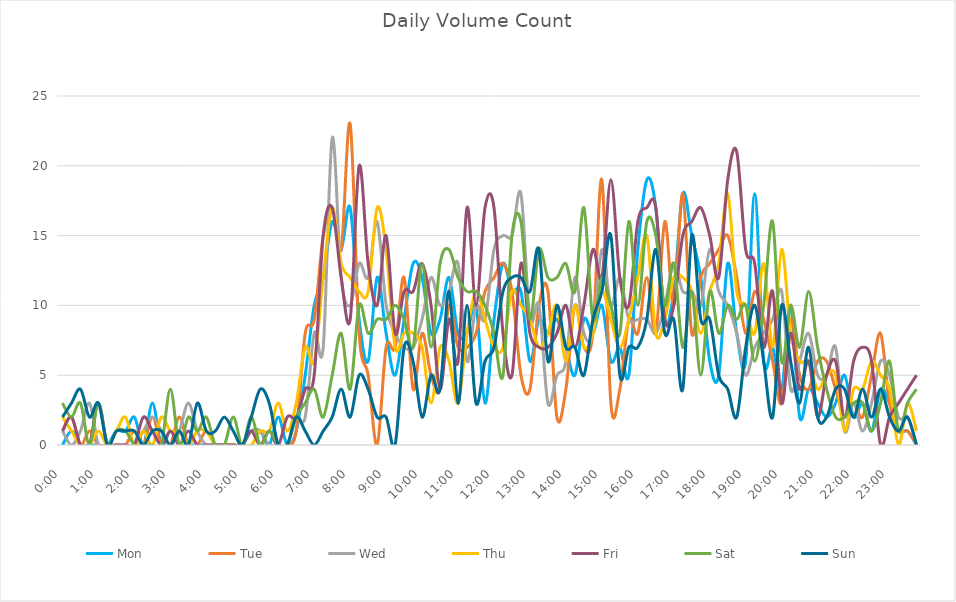
| Category | Mon | Tue | Wed | Thu | Fri | Sat | Sun |
|---|---|---|---|---|---|---|---|
| 0.0 | 0 | 1 | 1 | 2 | 1 | 3 | 2 |
| 0.010416666666666666 | 1 | 2 | 0 | 1 | 2 | 2 | 3 |
| 0.020833333333333332 | 0 | 0 | 1 | 0 | 0 | 3 | 4 |
| 0.03125 | 0 | 1 | 3 | 0 | 0 | 0 | 2 |
| 0.041666666666666664 | 0 | 0 | 0 | 1 | 3 | 3 | 3 |
| 0.05208333333333333 | 0 | 0 | 0 | 0 | 0 | 0 | 0 |
| 0.06249999999999999 | 1 | 0 | 0 | 1 | 0 | 1 | 1 |
| 0.07291666666666666 | 1 | 0 | 0 | 2 | 0 | 1 | 1 |
| 0.08333333333333333 | 2 | 1 | 0 | 0 | 0 | 0 | 1 |
| 0.09375 | 0 | 0 | 1 | 1 | 2 | 0 | 0 |
| 0.10416666666666667 | 3 | 2 | 2 | 0 | 1 | 0 | 1 |
| 0.11458333333333334 | 0 | 0 | 1 | 2 | 0 | 0 | 1 |
| 0.125 | 1 | 0 | 0 | 1 | 1 | 4 | 0 |
| 0.13541666666666666 | 0 | 2 | 1 | 1 | 0 | 0 | 1 |
| 0.14583333333333331 | 0 | 0 | 3 | 0 | 1 | 2 | 0 |
| 0.15624999999999997 | 0 | 0 | 1 | 1 | 0 | 1 | 3 |
| 0.16666666666666663 | 0 | 1 | 0 | 1 | 0 | 2 | 1 |
| 0.1770833333333333 | 0 | 0 | 0 | 0 | 0 | 0 | 1 |
| 0.18749999999999994 | 0 | 0 | 0 | 0 | 0 | 0 | 2 |
| 0.1979166666666666 | 0 | 0 | 0 | 0 | 0 | 2 | 1 |
| 0.20833333333333326 | 0 | 0 | 0 | 0 | 0 | 0 | 0 |
| 0.21874999999999992 | 1 | 1 | 1 | 0 | 1 | 2 | 2 |
| 0.22916666666666657 | 1 | 0 | 1 | 1 | 0 | 0 | 4 |
| 0.23958333333333323 | 0 | 1 | 0 | 1 | 1 | 1 | 3 |
| 0.2499999999999999 | 2 | 0 | 0 | 3 | 0 | 0 | 0 |
| 0.2604166666666666 | 0 | 0 | 0 | 1 | 2 | 0 | 0 |
| 0.27083333333333326 | 1 | 1 | 2 | 3 | 2 | 2 | 2 |
| 0.28124999999999994 | 5 | 8 | 2 | 7 | 4 | 3 | 1 |
| 0.29166666666666663 | 10 | 9 | 8 | 6 | 5 | 4 | 0 |
| 0.3020833333333333 | 12 | 15 | 7 | 12 | 15 | 2 | 1 |
| 0.3125 | 16 | 17 | 22 | 17 | 17 | 5 | 2 |
| 0.3229166666666667 | 14 | 14 | 12 | 13 | 12 | 8 | 4 |
| 0.33333333333333337 | 17 | 23 | 10 | 12 | 9 | 4 | 2 |
| 0.34375000000000006 | 9 | 8 | 13 | 11 | 20 | 10 | 5 |
| 0.35416666666666674 | 6 | 5 | 12 | 11 | 13 | 8 | 4 |
| 0.3645833333333334 | 12 | 0 | 16 | 17 | 10 | 9 | 2 |
| 0.3750000000000001 | 8 | 7 | 10 | 14 | 15 | 9 | 2 |
| 0.3854166666666668 | 5 | 7 | 8 | 7 | 8 | 10 | 0 |
| 0.3958333333333335 | 9 | 12 | 7 | 8 | 11 | 9 | 7 |
| 0.40625000000000017 | 13 | 4 | 7 | 8 | 11 | 7 | 6 |
| 0.41666666666666685 | 12 | 8 | 9 | 7 | 13 | 13 | 2 |
| 0.4270833333333333 | 8 | 5 | 12 | 3 | 10 | 7 | 5 |
| 0.4375000000000002 | 9 | 4 | 10 | 7 | 4 | 13 | 4 |
| 0.4479166666666669 | 12 | 10 | 11 | 6 | 9 | 14 | 11 |
| 0.4583333333333333 | 8 | 7 | 13 | 3 | 6 | 12 | 3 |
| 0.4687500000000003 | 8 | 7 | 6 | 8 | 17 | 11 | 10 |
| 0.47916666666666696 | 10 | 8 | 10 | 11 | 10 | 11 | 3 |
| 0.4895833333333333 | 3 | 11 | 9 | 9 | 17 | 10 | 6 |
| 0.5000000000000003 | 9 | 12 | 14 | 7 | 17 | 8 | 7 |
| 0.510416666666667 | 13 | 13 | 15 | 7 | 8 | 5 | 11 |
| 0.5208333333333334 | 11 | 11 | 15 | 11 | 5 | 15 | 12 |
| 0.5312500000000002 | 11 | 5 | 18 | 10 | 13 | 16 | 12 |
| 0.5416666666666669 | 6 | 4 | 9 | 9 | 8 | 9 | 11 |
| 0.5520833333333335 | 9 | 10 | 10 | 7 | 7 | 14 | 14 |
| 0.5625000000000001 | 8 | 11 | 3 | 8 | 7 | 12 | 6 |
| 0.5729166666666667 | 9 | 2 | 5 | 10 | 8 | 12 | 10 |
| 0.5833333333333334 | 7 | 4 | 6 | 6 | 10 | 13 | 7 |
| 0.59375 | 5 | 10 | 12 | 10 | 7 | 11 | 7 |
| 0.6041666666666666 | 9 | 7 | 8 | 7 | 10 | 17 | 5 |
| 0.6145833333333333 | 8 | 8 | 8 | 8 | 14 | 9 | 9 |
| 0.6249999999999999 | 10 | 19 | 14 | 11 | 12 | 12 | 11 |
| 0.6354166666666665 | 6 | 3 | 10 | 9 | 19 | 10 | 15 |
| 0.6458333333333331 | 7 | 4 | 12 | 7 | 12 | 8 | 5 |
| 0.6562499999999998 | 5 | 9 | 9 | 9 | 10 | 16 | 7 |
| 0.6666666666666666 | 14 | 8 | 9 | 12 | 16 | 10 | 7 |
| 0.677083333333333 | 19 | 12 | 9 | 15 | 17 | 16 | 9 |
| 0.6874999999999997 | 17 | 8 | 8 | 8 | 17 | 15 | 14 |
| 0.6979166666666666 | 9 | 16 | 10 | 9 | 9 | 10 | 8 |
| 0.7083333333333329 | 11 | 10 | 13 | 12 | 10 | 13 | 9 |
| 0.7187499999999996 | 18 | 18 | 11 | 12 | 15 | 7 | 4 |
| 0.7291666666666666 | 15 | 8 | 11 | 11 | 16 | 11 | 15 |
| 0.7395833333333328 | 12 | 12 | 10 | 8 | 17 | 5 | 9 |
| 0.75 | 6 | 13 | 14 | 11 | 15 | 11 | 9 |
| 0.7604166666666666 | 5 | 14 | 11 | 13 | 12 | 8 | 5 |
| 0.7708333333333327 | 13 | 15 | 10 | 18 | 19 | 10 | 4 |
| 0.78125 | 8 | 12 | 8 | 11 | 21 | 9 | 2 |
| 0.7916666666666666 | 6 | 8 | 5 | 10 | 14 | 10 | 7 |
| 0.8020833333333326 | 18 | 11 | 7 | 8 | 13 | 6 | 10 |
| 0.8125 | 6 | 9 | 8 | 13 | 7 | 10 | 6 |
| 0.8229166666666666 | 7 | 6 | 9 | 7 | 11 | 16 | 2 |
| 0.8333333333333334 | 4 | 3 | 11 | 14 | 3 | 6 | 10 |
| 0.84375 | 10 | 9 | 4 | 8 | 8 | 10 | 6 |
| 0.8541666666666666 | 2 | 5 | 6 | 6 | 4 | 7 | 3 |
| 0.8645833333333334 | 4 | 4 | 8 | 6 | 6 | 11 | 7 |
| 0.875 | 3 | 6 | 5 | 4 | 2 | 7 | 2 |
| 0.8854166666666666 | 2 | 6 | 5 | 5 | 5 | 4 | 2 |
| 0.8958333333333334 | 3 | 4 | 7 | 5 | 6 | 2 | 4 |
| 0.90625 | 5 | 2 | 1 | 1 | 2 | 2 | 4 |
| 0.9166666666666666 | 2 | 3 | 3 | 4 | 6 | 3 | 2 |
| 0.9270833333333334 | 3 | 2 | 1 | 4 | 7 | 3 | 4 |
| 0.9375 | 1 | 5 | 3 | 6 | 6 | 1 | 2 |
| 0.9479166666666666 | 4 | 8 | 6 | 5 | 0 | 3 | 4 |
| 0.9583333333333334 | 3 | 3 | 5 | 4 | 2 | 6 | 2 |
| 0.96875 | 1 | 1 | 2 | 0 | 3 | 1 | 1 |
| 0.9791666666666666 | 1 | 1 | 2 | 3 | 4 | 3 | 2 |
| 0.9895833333333334 | 0 | 0 | 0 | 1 | 5 | 4 | 0 |